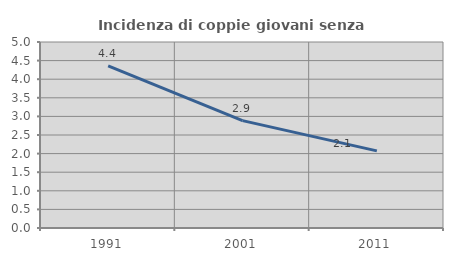
| Category | Incidenza di coppie giovani senza figli |
|---|---|
| 1991.0 | 4.359 |
| 2001.0 | 2.887 |
| 2011.0 | 2.073 |